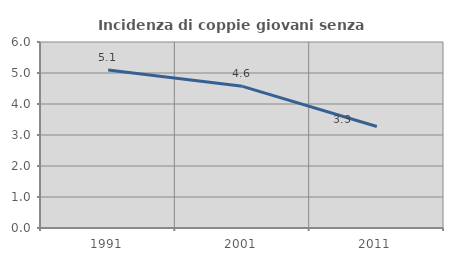
| Category | Incidenza di coppie giovani senza figli |
|---|---|
| 1991.0 | 5.097 |
| 2001.0 | 4.569 |
| 2011.0 | 3.275 |